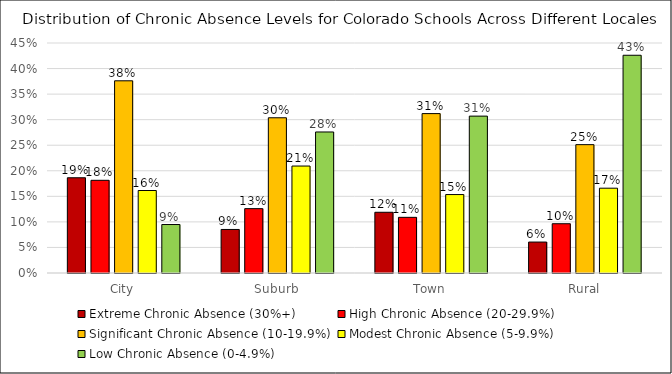
| Category | Extreme Chronic Absence (30%+) | High Chronic Absence (20-29.9%) | Significant Chronic Absence (10-19.9%) | Modest Chronic Absence (5-9.9%) | Low Chronic Absence (0-4.9%) |
|---|---|---|---|---|---|
| City | 0.186 | 0.181 | 0.376 | 0.161 | 0.095 |
| Suburb | 0.085 | 0.126 | 0.304 | 0.209 | 0.276 |
| Town | 0.119 | 0.109 | 0.312 | 0.153 | 0.307 |
| Rural | 0.061 | 0.096 | 0.251 | 0.166 | 0.426 |